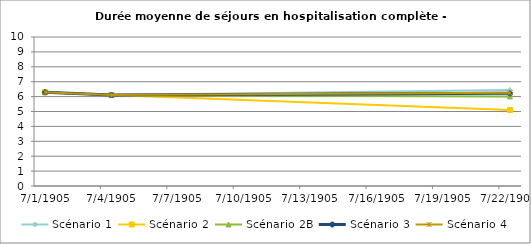
| Category | Scénario 1 | Scénario 2 | Scénario 2B | Scénario 3 | Scénario 4 |
|---|---|---|---|---|---|
| 2009.0 | 6.293 | 6.293 | 6.293 | 6.293 | 6.293 |
| 2012.0 | 6.102 | 6.102 | 6.102 | 6.102 | 6.102 |
| 2030.0 | 6.437 | 5.102 | 6.014 | 6.217 | 6.252 |